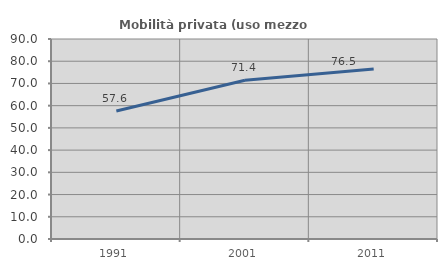
| Category | Mobilità privata (uso mezzo privato) |
|---|---|
| 1991.0 | 57.569 |
| 2001.0 | 71.402 |
| 2011.0 | 76.54 |